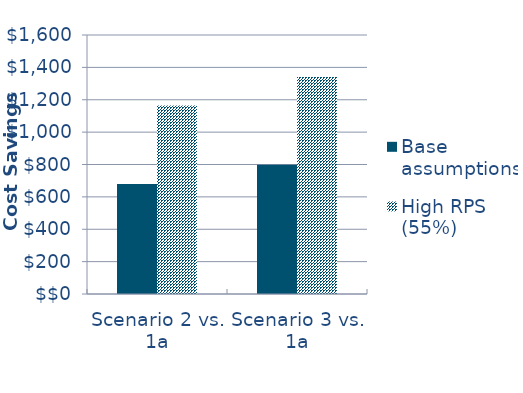
| Category | Base assumptions  | High RPS (55%) |
|---|---|---|
| Scenario 2 vs. 1a | -679.806 | -1164.146 |
| Scenario 3 vs. 1a | -799.049 | -1341.243 |